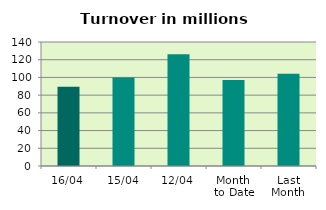
| Category | Series 0 |
|---|---|
| 16/04 | 89.462 |
| 15/04 | 99.9 |
| 12/04 | 126.184 |
| Month 
to Date | 96.977 |
| Last
Month | 104.085 |